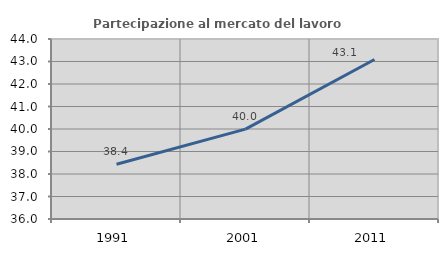
| Category | Partecipazione al mercato del lavoro  femminile |
|---|---|
| 1991.0 | 38.435 |
| 2001.0 | 39.993 |
| 2011.0 | 43.089 |